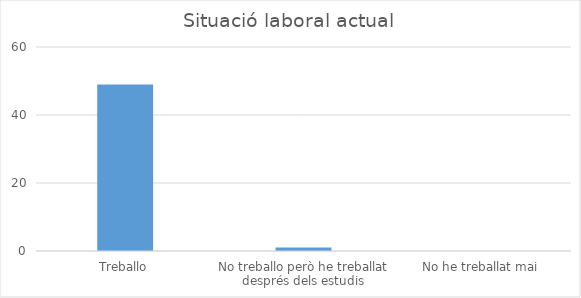
| Category | Series 0 |
|---|---|
| Treballo | 49 |
| No treballo però he treballat després dels estudis | 1 |
| No he treballat mai | 0 |